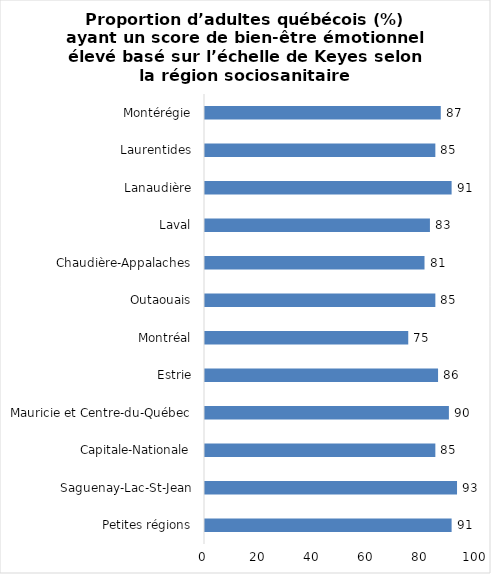
| Category | Series 0 |
|---|---|
| Petites régions | 91 |
| Saguenay-Lac-St-Jean | 93 |
| Capitale-Nationale | 85 |
| Mauricie et Centre-du-Québec | 90 |
| Estrie | 86 |
| Montréal | 75 |
| Outaouais | 85 |
| Chaudière-Appalaches | 81 |
| Laval | 83 |
| Lanaudière | 91 |
| Laurentides | 85 |
| Montérégie | 87 |